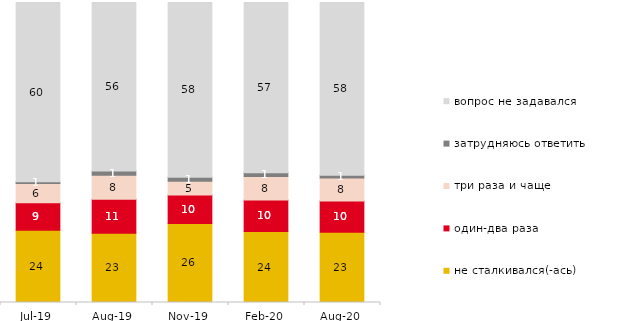
| Category | не сталкивался(-ась) | один-два раза | три раза и чаще | затрудняюсь ответить | вопрос не задавался |
|---|---|---|---|---|---|
| 2019-07-01 | 24.059 | 9.208 | 6.386 | 0.594 | 59.752 |
| 2019-08-01 | 23.077 | 11.339 | 8.042 | 1.399 | 56.144 |
| 2019-11-01 | 26.337 | 9.505 | 4.604 | 1.337 | 58.218 |
| 2020-02-01 | 23.663 | 10.495 | 7.871 | 1.188 | 56.782 |
| 2020-08-01 | 23.436 | 10.377 | 7.696 | 0.894 | 57.597 |